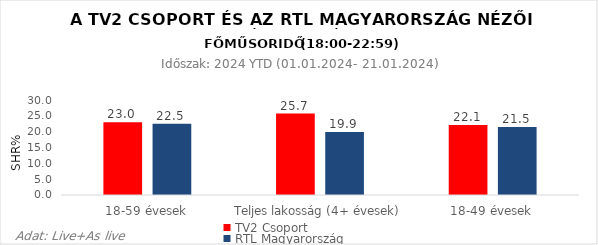
| Category | TV2 Csoport | RTL Magyarország |
|---|---|---|
| 18-59 évesek | 23 | 22.5 |
| Teljes lakosság (4+ évesek) | 25.7 | 19.9 |
| 18-49 évesek | 22.1 | 21.5 |